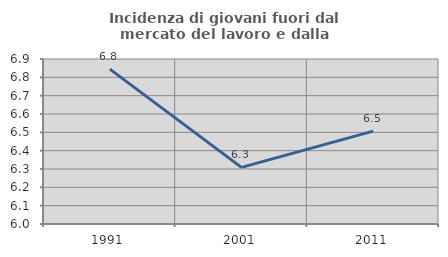
| Category | Incidenza di giovani fuori dal mercato del lavoro e dalla formazione  |
|---|---|
| 1991.0 | 6.845 |
| 2001.0 | 6.309 |
| 2011.0 | 6.507 |